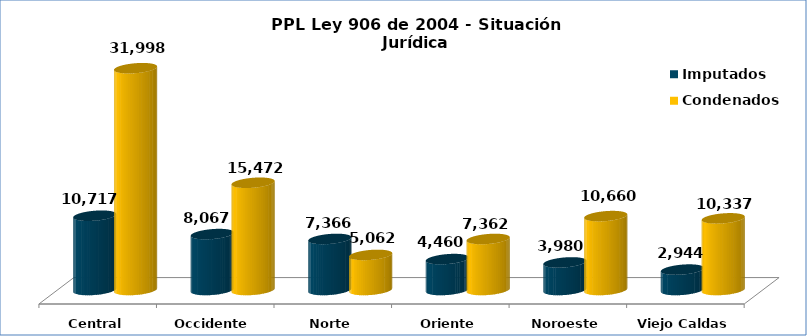
| Category | Imputados | Condenados |
|---|---|---|
| Central | 10717 | 31998 |
| Occidente | 8067 | 15472 |
| Norte | 7366 | 5062 |
| Oriente | 4460 | 7362 |
| Noroeste | 3980 | 10660 |
| Viejo Caldas | 2944 | 10337 |